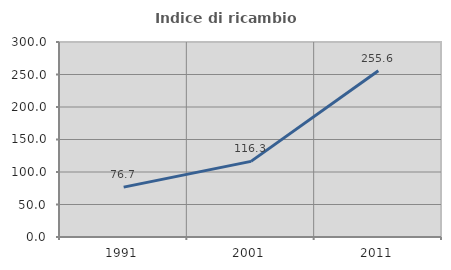
| Category | Indice di ricambio occupazionale  |
|---|---|
| 1991.0 | 76.696 |
| 2001.0 | 116.341 |
| 2011.0 | 255.634 |